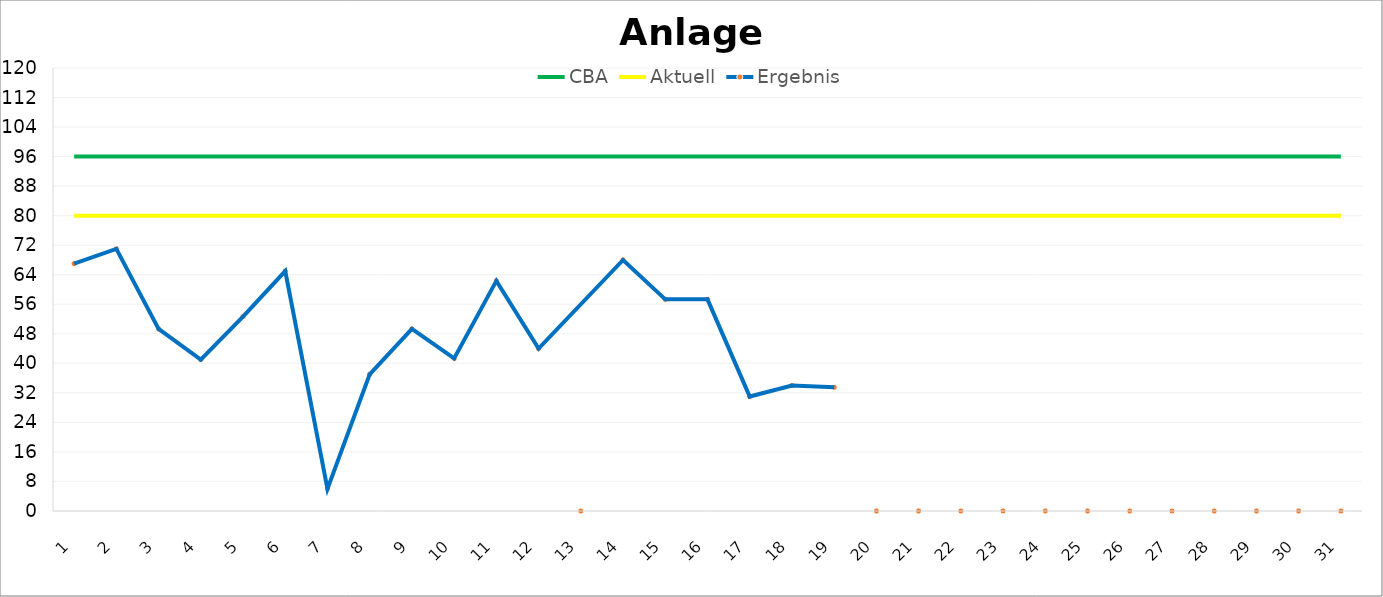
| Category | CBA | Aktuell |
|---|---|---|
| 1.0 | 96 | 80 |
| 2.0 | 96 | 80 |
| 3.0 | 96 | 80 |
| 4.0 | 96 | 80 |
| 5.0 | 96 | 80 |
| 6.0 | 96 | 80 |
| 7.0 | 96 | 80 |
| 8.0 | 96 | 80 |
| 9.0 | 96 | 80 |
| 10.0 | 96 | 80 |
| 11.0 | 96 | 80 |
| 12.0 | 96 | 80 |
| 13.0 | 96 | 80 |
| 14.0 | 96 | 80 |
| 15.0 | 96 | 80 |
| 16.0 | 96 | 80 |
| 17.0 | 96 | 80 |
| 18.0 | 96 | 80 |
| 19.0 | 96 | 80 |
| 20.0 | 96 | 80 |
| 21.0 | 96 | 80 |
| 22.0 | 96 | 80 |
| 23.0 | 96 | 80 |
| 24.0 | 96 | 80 |
| 25.0 | 96 | 80 |
| 26.0 | 96 | 80 |
| 27.0 | 96 | 80 |
| 28.0 | 96 | 80 |
| 29.0 | 96 | 80 |
| 30.0 | 96 | 80 |
| 31.0 | 96 | 80 |